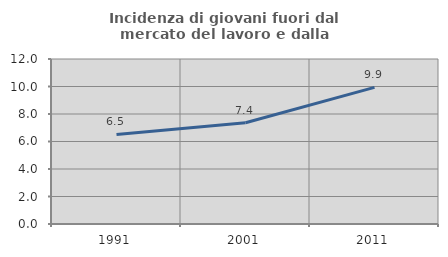
| Category | Incidenza di giovani fuori dal mercato del lavoro e dalla formazione  |
|---|---|
| 1991.0 | 6.517 |
| 2001.0 | 7.362 |
| 2011.0 | 9.937 |